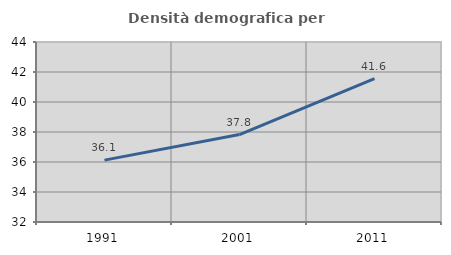
| Category | Densità demografica |
|---|---|
| 1991.0 | 36.126 |
| 2001.0 | 37.83 |
| 2011.0 | 41.551 |